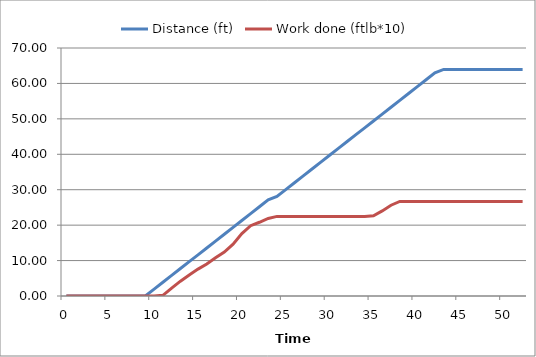
| Category | Distance (ft) | Work done (ftlb*10) |
|---|---|---|
| 0.0 | 0 | 0 |
| 1.0 | 0 | 0 |
| 2.0 | 0 | 0 |
| 3.0 | 0 | 0 |
| 4.0 | 0 | 0 |
| 5.0 | 0 | 0 |
| 6.0 | 0 | 0 |
| 7.0 | 0 | 0 |
| 8.0 | 0 | 0 |
| 9.0 | 0 | 0 |
| 10.0 | 1.938 | 0 |
| 11.0 | 3.875 | 0.195 |
| 12.0 | 5.813 | 2.237 |
| 13.0 | 7.75 | 4.182 |
| 14.0 | 9.688 | 5.933 |
| 15.0 | 11.625 | 7.586 |
| 16.0 | 13.563 | 9.045 |
| 17.0 | 15.501 | 10.796 |
| 18.0 | 17.438 | 12.4 |
| 19.0 | 19.376 | 14.637 |
| 20.0 | 21.313 | 17.604 |
| 21.0 | 23.251 | 19.841 |
| 22.0 | 25.188 | 20.813 |
| 23.0 | 27.126 | 21.883 |
| 24.0 | 28.095 | 22.467 |
| 25.0 | 30.032 | 22.467 |
| 26.0 | 31.97 | 22.467 |
| 27.0 | 33.907 | 22.467 |
| 28.0 | 35.845 | 22.467 |
| 29.0 | 37.783 | 22.467 |
| 30.0 | 39.72 | 22.467 |
| 31.0 | 41.658 | 22.467 |
| 32.0 | 43.595 | 22.467 |
| 33.0 | 45.533 | 22.467 |
| 34.0 | 47.47 | 22.467 |
| 35.0 | 49.408 | 22.661 |
| 36.0 | 51.346 | 24.023 |
| 37.0 | 53.283 | 25.628 |
| 38.0 | 55.221 | 26.697 |
| 39.0 | 57.158 | 26.697 |
| 40.0 | 59.096 | 26.697 |
| 41.0 | 61.033 | 26.697 |
| 42.0 | 62.971 | 26.697 |
| 43.0 | 63.94 | 26.697 |
| 44.0 | 63.94 | 26.697 |
| 45.0 | 63.94 | 26.697 |
| 46.0 | 63.94 | 26.697 |
| 47.0 | 63.94 | 26.697 |
| 48.0 | 63.94 | 26.697 |
| 49.0 | 63.94 | 26.697 |
| 50.0 | 63.94 | 26.697 |
| 51.0 | 63.94 | 26.697 |